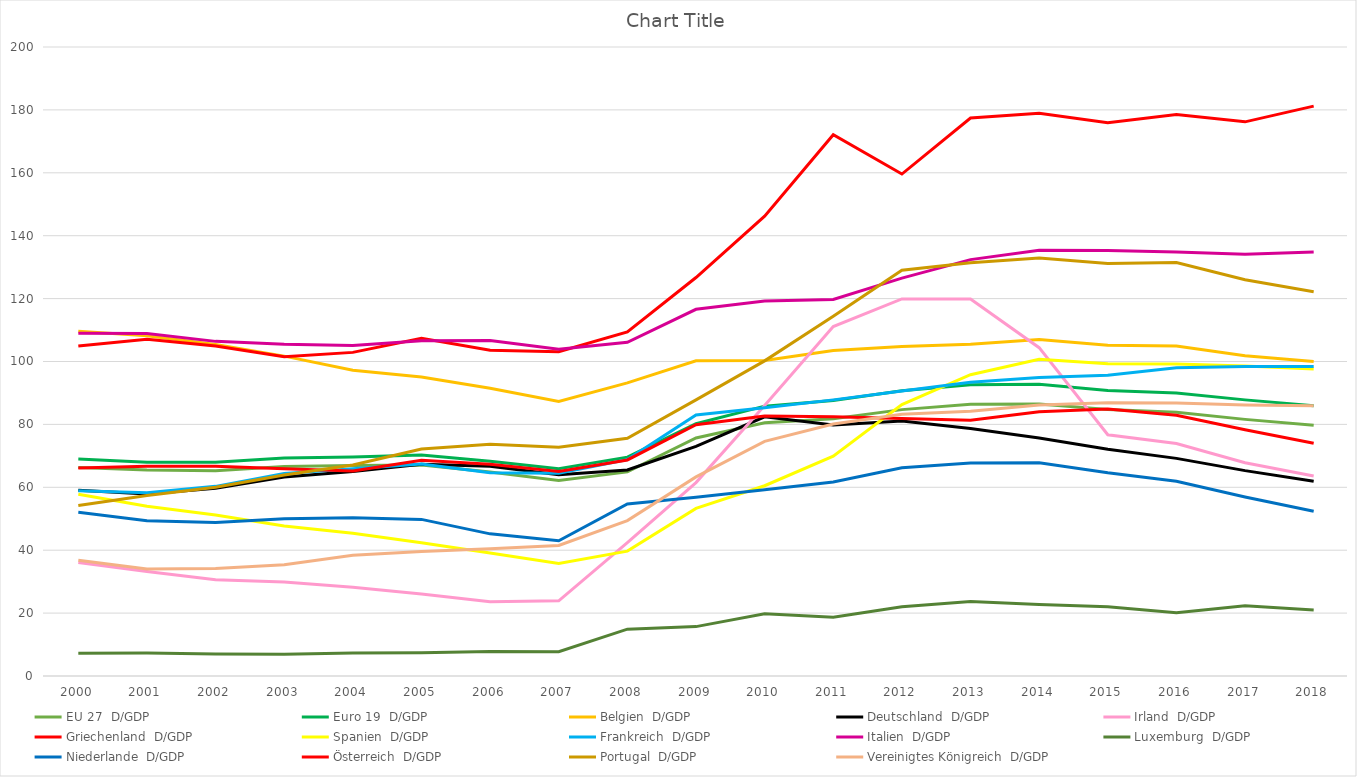
| Category | EU 27 | Euro 19 | Belgien | Deutschland | Irland | Griechenland | Spanien | Frankreich | Italien | Luxemburg | Niederlande | Österreich | Portugal | Vereinigtes Königreich |
|---|---|---|---|---|---|---|---|---|---|---|---|---|---|---|
| 2000 |  |  |  |  |  |  |  |  |  |  |  |  |  |  |
| 2001 |  |  |  |  |  |  |  |  |  |  |  |  |  |  |
| 2002 |  |  |  |  |  |  |  |  |  |  |  |  |  |  |
| 2003 |  |  |  |  |  |  |  |  |  |  |  |  |  |  |
| 2004 |  |  |  |  |  |  |  |  |  |  |  |  |  |  |
| 2005 |  |  |  |  |  |  |  |  |  |  |  |  |  |  |
| 2006 |  |  |  |  |  |  |  |  |  |  |  |  |  |  |
| 2007 |  |  |  |  |  |  |  |  |  |  |  |  |  |  |
| 2008 |  |  |  |  |  |  |  |  |  |  |  |  |  |  |
| 2009 |  |  |  |  |  |  |  |  |  |  |  |  |  |  |
| 2010 |  |  |  |  |  |  |  |  |  |  |  |  |  |  |
| 2011 |  |  |  |  |  |  |  |  |  |  |  |  |  |  |
| 2012 |  |  |  |  |  |  |  |  |  |  |  |  |  |  |
| 2013 |  |  |  |  |  |  |  |  |  |  |  |  |  |  |
| 2014 |  |  |  |  |  |  |  |  |  |  |  |  |  |  |
| 2015 |  |  |  |  |  |  |  |  |  |  |  |  |  |  |
| 2016 |  |  |  |  |  |  |  |  |  |  |  |  |  |  |
| 2017 |  |  |  |  |  |  |  |  |  |  |  |  |  |  |
| 2018 |  |  |  |  |  |  |  |  |  |  |  |  |  |  |